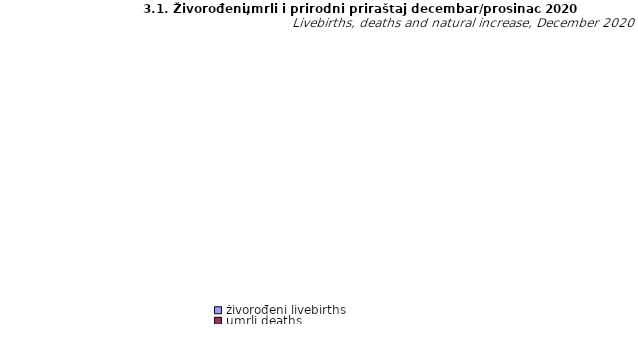
| Category | živorođeni livebirths | umrli deaths | prirodni priraštaj natural increase |
|---|---|---|---|
| Unsko - sanski | 131 | 313 | -182 |
| Kanton Posavski | 17 | 83 | -66 |
| Tuzlanski | 256 | 733 | -477 |
| Zeničko - dobojski | 299 | 587 | -288 |
| Bosansko - podrinjski | 8 | 32 | -24 |
| Srednjobosanski | 171 | 391 | -220 |
| Hercegovačko-neretvanski | 126 | 350 | -224 |
| Zapadnohercegovački | 88 | 111 | -23 |
| Kanton Sarajevo | 362 | 676 | -314 |
| Kanton 10 | 35 | 154 | -119 |